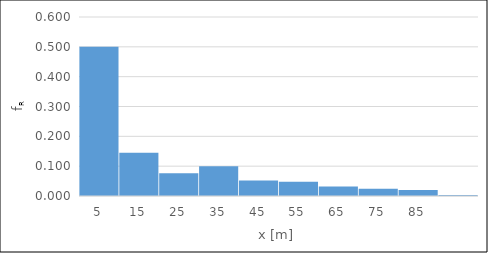
| Category | Series 0 |
|---|---|
| 5.0 | 0.5 |
| 15.0 | 0.145 |
| 25.0 | 0.076 |
| 35.0 | 0.1 |
| 45.0 | 0.052 |
| 55.0 | 0.048 |
| 65.0 | 0.032 |
| 75.0 | 0.024 |
| 85.0 | 0.02 |